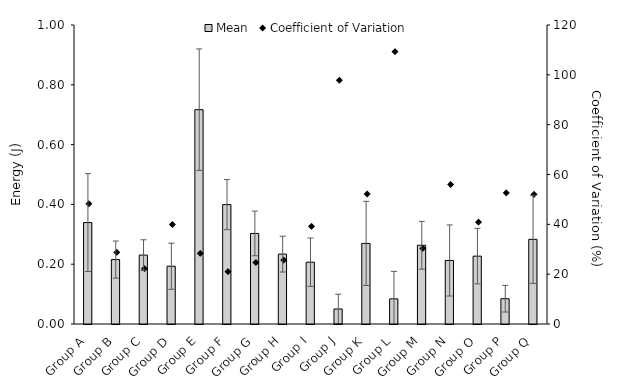
| Category | Mean |
|---|---|
| Group A | 0.339 |
| Group B | 0.215 |
| Group C | 0.23 |
| Group D | 0.193 |
| Group E | 0.717 |
| Group F | 0.399 |
| Group G | 0.303 |
| Group H | 0.234 |
| Group I | 0.207 |
| Group J | 0.05 |
| Group K | 0.27 |
| Group L | 0.084 |
| Group M | 0.263 |
| Group N | 0.212 |
| Group O | 0.227 |
| Group P | 0.085 |
| Group Q | 0.283 |